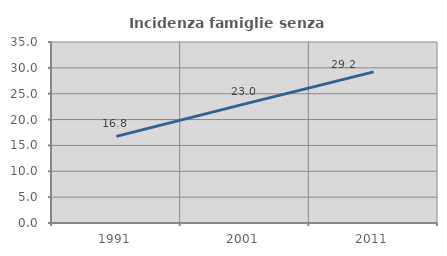
| Category | Incidenza famiglie senza nuclei |
|---|---|
| 1991.0 | 16.752 |
| 2001.0 | 23.027 |
| 2011.0 | 29.223 |